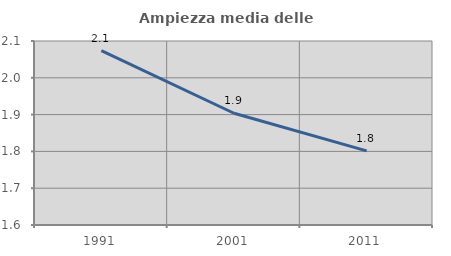
| Category | Ampiezza media delle famiglie |
|---|---|
| 1991.0 | 2.074 |
| 2001.0 | 1.904 |
| 2011.0 | 1.801 |